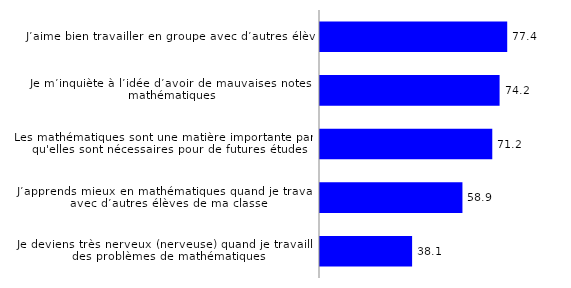
| Category | Series 0 |
|---|---|
| Je deviens très nerveux (nerveuse) quand je travaille à des problèmes de mathématiques | 38.06 |
| J’apprends mieux en mathématiques quand je travaille avec d’autres élèves de ma classe  | 58.86 |
| Les mathématiques sont une matière importante parce qu'elles sont nécessaires pour de futures études | 71.19 |
| Je m’inquiète à l’idée d’avoir de mauvaises notes en mathématiques | 74.21 |
| J’aime bien travailler en groupe avec d’autres élèves | 77.36 |